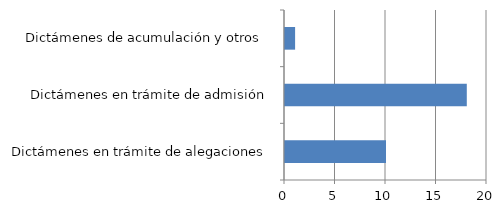
| Category | Series 0 |
|---|---|
| Dictámenes en trámite de alegaciones | 10 |
| Dictámenes en trámite de admisión | 18 |
| Dictámenes de acumulación y otros  | 1 |